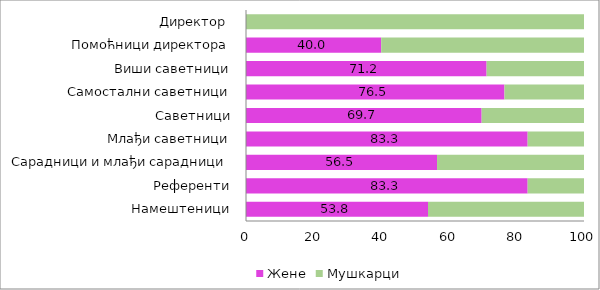
| Category | Жене | Мушкарци |
|---|---|---|
| Намештеници | 53.846 | 46.154 |
| Референти | 83.333 | 16.667 |
| Сарадници и млађи сарадници | 56.522 | 43.478 |
| Млађи саветници | 83.333 | 16.667 |
| Саветници | 69.718 | 30.282 |
| Самостални саветници | 76.471 | 23.529 |
| Виши саветници | 71.186 | 28.814 |
| Помоћници директора | 40 | 60 |
| Директор  | 0 | 100 |